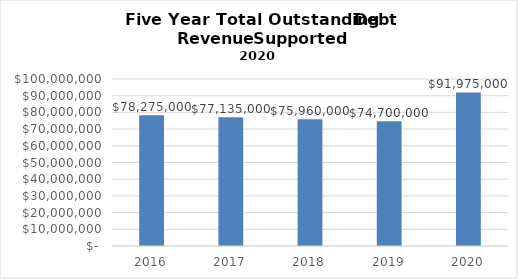
| Category | Series 0 |
|---|---|
| 2016.0 | 78275000 |
| 2017.0 | 77135000 |
| 2018.0 | 75960000 |
| 2019.0 | 74700000 |
| 2020.0 | 91975000 |